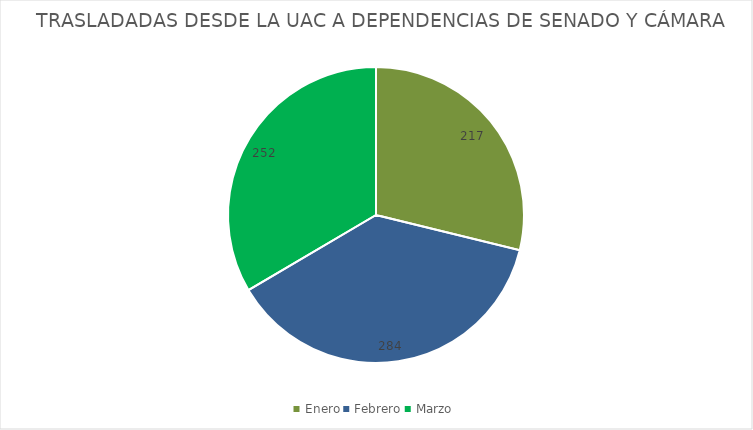
| Category | TRASLADADAS DESDE LA UAC A DEPENDENCIAS DE SENADO Y CÁMARA |
|---|---|
| Enero | 217 |
| Febrero | 284 |
| Marzo | 252 |